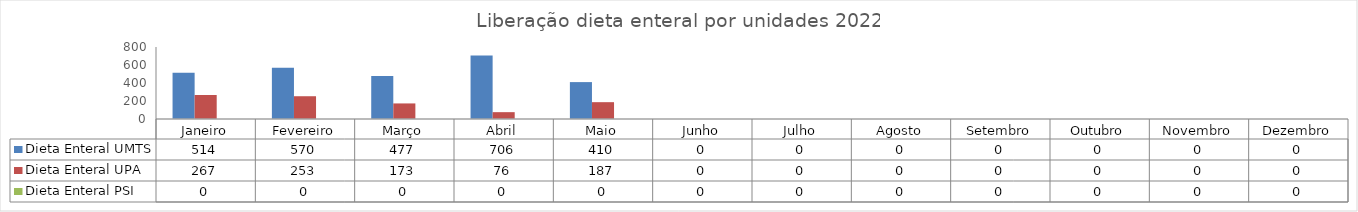
| Category | Dieta Enteral UMTS | Dieta Enteral UPA | Dieta Enteral PSI |
|---|---|---|---|
| Janeiro | 514 | 267 | 0 |
| Fevereiro | 570 | 253 | 0 |
| Março | 477 | 173 | 0 |
| Abril | 706 | 76 | 0 |
| Maio | 410 | 187 | 0 |
| Junho | 0 | 0 | 0 |
| Julho | 0 | 0 | 0 |
| Agosto | 0 | 0 | 0 |
| Setembro | 0 | 0 | 0 |
| Outubro | 0 | 0 | 0 |
| Novembro | 0 | 0 | 0 |
| Dezembro | 0 | 0 | 0 |